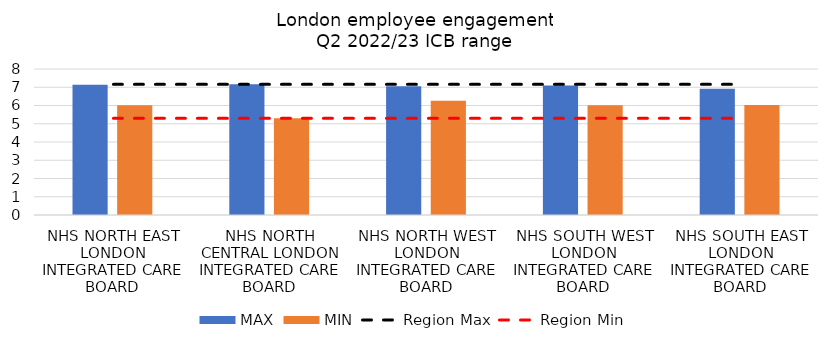
| Category | MAX | MIN |
|---|---|---|
| NHS NORTH EAST LONDON INTEGRATED CARE BOARD | 7.139 | 6.011 |
| NHS NORTH CENTRAL LONDON INTEGRATED CARE BOARD | 7.158 | 5.295 |
| NHS NORTH WEST LONDON INTEGRATED CARE BOARD | 7.053 | 6.255 |
| NHS SOUTH WEST LONDON INTEGRATED CARE BOARD | 7.095 | 6.012 |
| NHS SOUTH EAST LONDON INTEGRATED CARE BOARD | 6.924 | 6.023 |